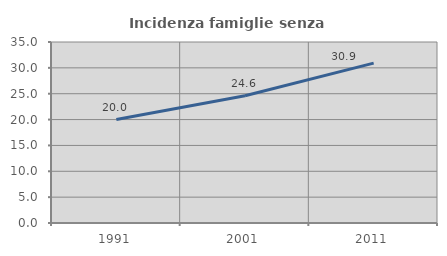
| Category | Incidenza famiglie senza nuclei |
|---|---|
| 1991.0 | 20 |
| 2001.0 | 24.612 |
| 2011.0 | 30.921 |